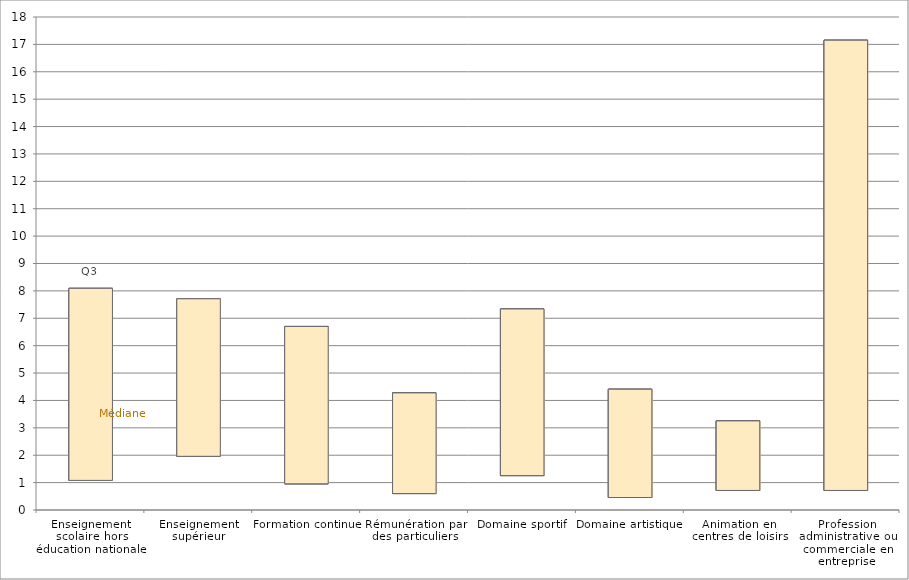
| Category | Q1 | Médiane | Moyenne | Q3 |
|---|---|---|---|---|
| Enseignement scolaire hors éducation nationale | 1.081 | 3.452 | 5.672 | 8.094 |
| Enseignement supérieur | 1.96 | 4.189 | 6.039 | 7.711 |
| Formation continue | 0.956 | 2.63 | 4.897 | 6.702 |
| Rémunération par des particuliers | 0.6 | 1.519 | 3.184 | 4.275 |
| Domaine sportif | 1.256 | 3.692 | 5.744 | 7.339 |
| Domaine artistique | 0.456 | 1.294 | 3.863 | 4.41 |
| Animation en centres de loisirs | 0.714 | 1.542 | 2.533 | 3.253 |
| Profession administrative ou commerciale en entreprise | 0.714 | 2.36 | 9.168 | 17.153 |